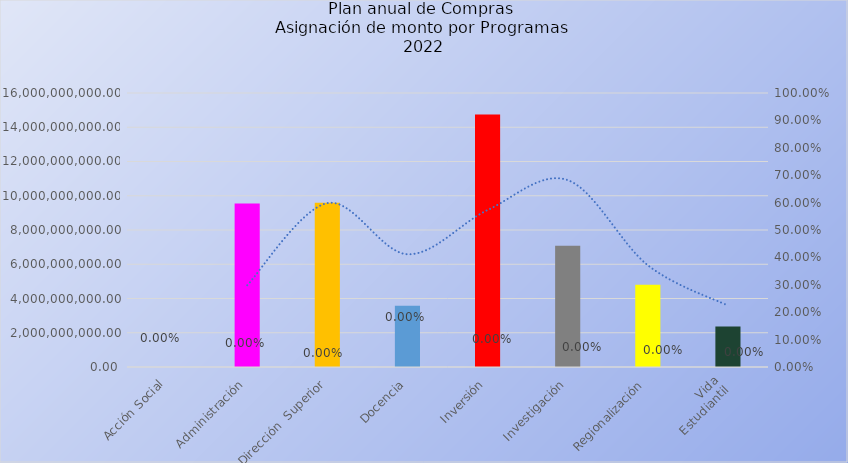
| Category | Series 0 |
|---|---|
| Acción Social | 0 |
| Administración | 9547822400.93 |
| Dirección  Superior | 9591378210.442 |
| Docencia | 3578877962.65 |
| Inversión | 14749231802.96 |
| Investigación | 7078762031.43 |
| Regionalización | 4806245159.43 |
| Vida
Estudiantil | 2362361851.64 |